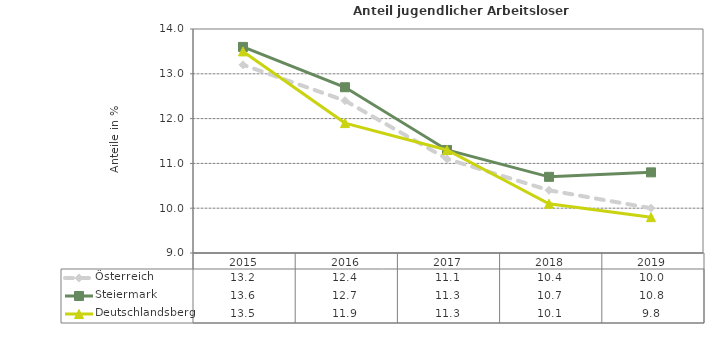
| Category | Österreich | Steiermark | Deutschlandsberg |
|---|---|---|---|
| 2019.0 | 10 | 10.8 | 9.8 |
| 2018.0 | 10.4 | 10.7 | 10.1 |
| 2017.0 | 11.1 | 11.3 | 11.3 |
| 2016.0 | 12.4 | 12.7 | 11.9 |
| 2015.0 | 13.2 | 13.6 | 13.5 |